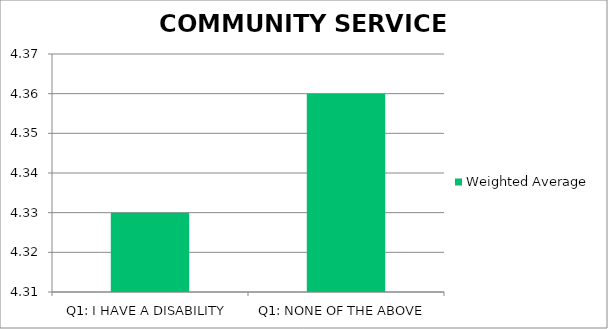
| Category | Weighted Average |
|---|---|
| Q1: I HAVE A DISABILITY | 4.33 |
| Q1: NONE OF THE ABOVE | 4.36 |